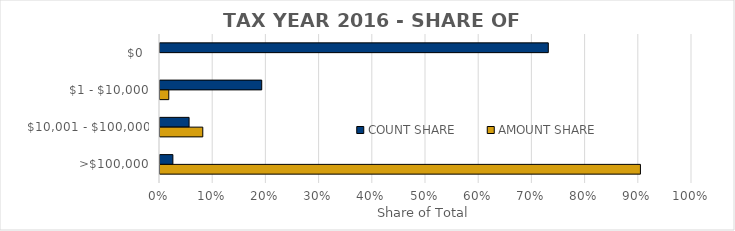
| Category | COUNT SHARE | AMOUNT SHARE |
|---|---|---|
| $0  | 0.73 | 0 |
| $1 - $10,000 | 0.191 | 0.017 |
| $10,001 - $100,000 | 0.055 | 0.08 |
| >$100,000 | 0.024 | 0.903 |